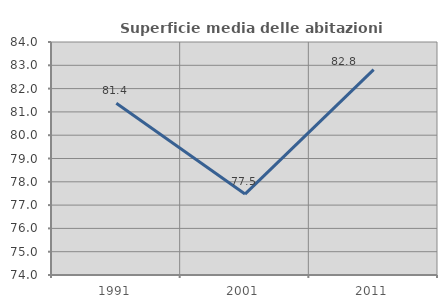
| Category | Superficie media delle abitazioni occupate |
|---|---|
| 1991.0 | 81.37 |
| 2001.0 | 77.474 |
| 2011.0 | 82.818 |